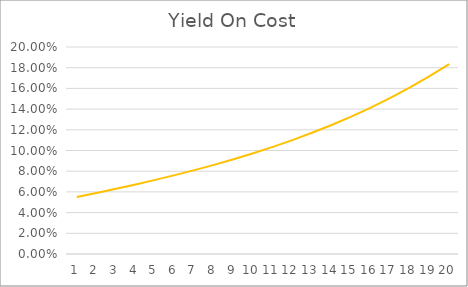
| Category | Yield On Cost |
|---|---|
| 1.0 | 0.055 |
| 2.0 | 0.059 |
| 3.0 | 0.063 |
| 4.0 | 0.067 |
| 5.0 | 0.072 |
| 6.0 | 0.076 |
| 7.0 | 0.081 |
| 8.0 | 0.086 |
| 9.0 | 0.092 |
| 10.0 | 0.097 |
| 11.0 | 0.103 |
| 12.0 | 0.11 |
| 13.0 | 0.117 |
| 14.0 | 0.125 |
| 15.0 | 0.133 |
| 16.0 | 0.141 |
| 17.0 | 0.151 |
| 18.0 | 0.161 |
| 19.0 | 0.172 |
| 20.0 | 0.183 |